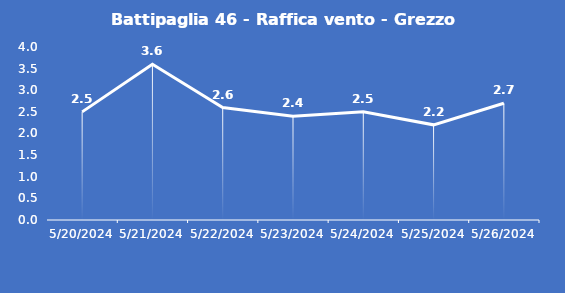
| Category | Battipaglia 46 - Raffica vento - Grezzo (m/s) |
|---|---|
| 5/20/24 | 2.5 |
| 5/21/24 | 3.6 |
| 5/22/24 | 2.6 |
| 5/23/24 | 2.4 |
| 5/24/24 | 2.5 |
| 5/25/24 | 2.2 |
| 5/26/24 | 2.7 |